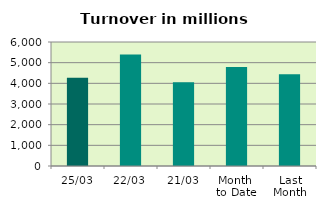
| Category | Series 0 |
|---|---|
| 25/03 | 4272.531 |
| 22/03 | 5395.926 |
| 21/03 | 4057.709 |
| Month 
to Date | 4791.06 |
| Last
Month | 4438.793 |